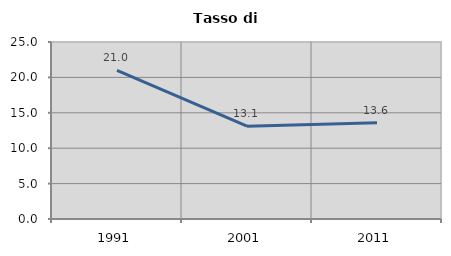
| Category | Tasso di disoccupazione   |
|---|---|
| 1991.0 | 21.004 |
| 2001.0 | 13.113 |
| 2011.0 | 13.584 |